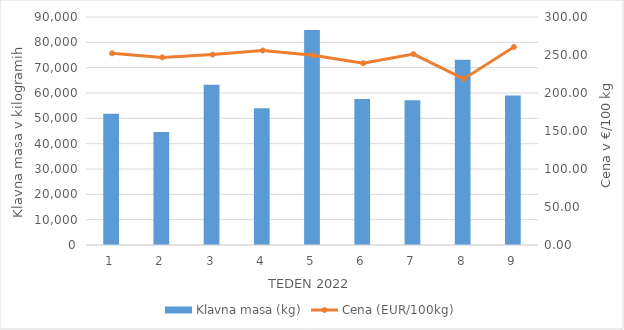
| Category | Klavna masa (kg) |
|---|---|
| 1.0 | 51818 |
| 2.0 | 44619 |
| 3.0 | 63233 |
| 4.0 | 53993 |
| 5.0 | 84871 |
| 6.0 | 57648 |
| 7.0 | 57159 |
| 8.0 | 73139 |
| 9.0 | 59056 |